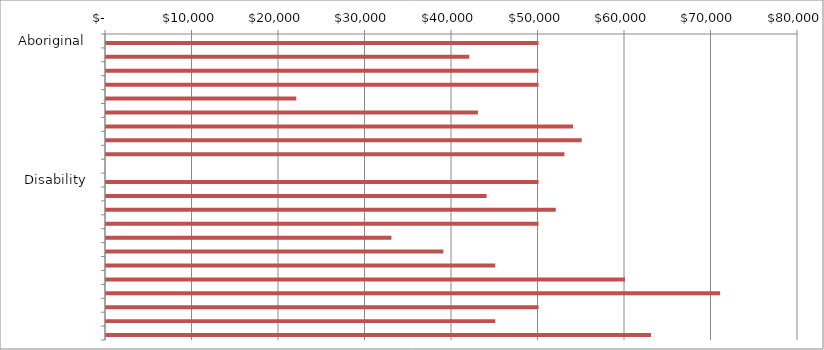
| Category | Series 0 | Series 1 |
|---|---|---|
|  Aboriginal  | 0 | 50000 |
|    | 0 | 42000 |
|    | 0 | 50000 |
|  Age Group  | 0 | 50000 |
|    | 0 | 22000 |
|    | 0 | 43000 |
|    | 0 | 54000 |
|    | 0 | 55000 |
|    | 0 | 53000 |
|    | 0 | 0 |
|  Disability  | 0 | 50000 |
|    | 0 | 44000 |
|    | 0 | 52000 |
|  Education  | 0 | 50000 |
|    | 0 | 33000 |
|    | 0 | 39000 |
|    | 0 | 45000 |
|    | 0 | 60000 |
|    | 0 | 71000 |
|  Sector  | 0 | 50000 |
|    | 0 | 45000 |
|    | 0 | 63000 |